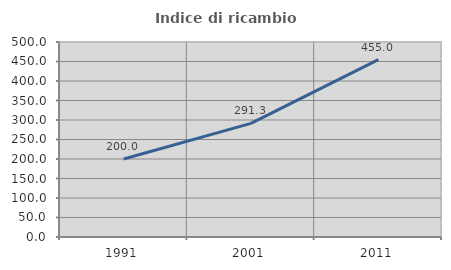
| Category | Indice di ricambio occupazionale  |
|---|---|
| 1991.0 | 200 |
| 2001.0 | 291.304 |
| 2011.0 | 455 |